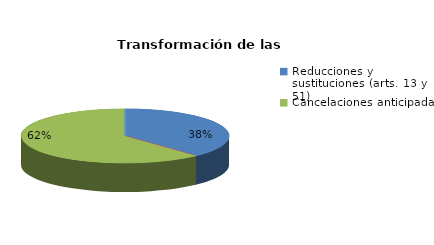
| Category | Series 0 |
|---|---|
| Reducciones y sustituciones (arts. 13 y 51) | 8 |
| Por quebrantamiento (art. 50.2) | 0 |
| Cancelaciones anticipadas | 13 |
| Traslado a Centros Penitenciarios | 0 |
| Conversión internamientos en cerrados (art. 51.2) | 0 |